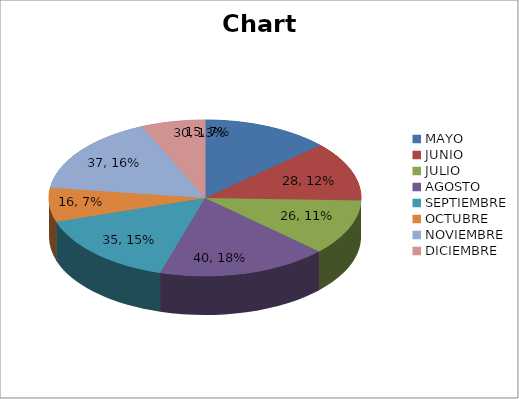
| Category | Series 0 |
|---|---|
| MAYO | 30 |
| JUNIO | 28 |
| JULIO | 26 |
| AGOSTO | 40 |
| SEPTIEMBRE | 35 |
| OCTUBRE | 16 |
| NOVIEMBRE | 37 |
| DICIEMBRE | 15 |